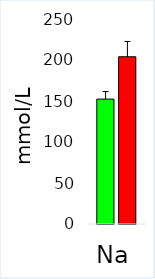
| Category | Control | ASD |
|---|---|---|
| Na | 152.309 | 203.954 |